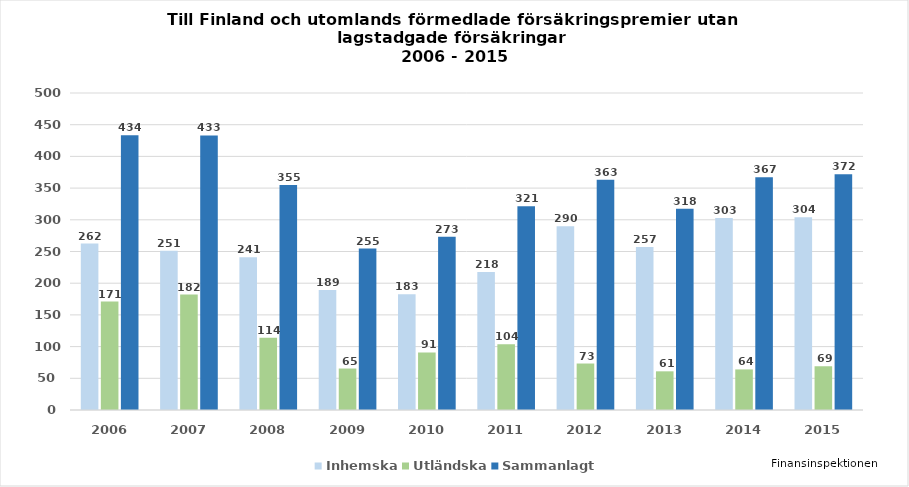
| Category | Inhemska | Utländska | Sammanlagt |
|---|---|---|---|
| 2006.0 | 262.471 | 171.056 | 433.526 |
| 2007.0 | 251 | 182 | 433 |
| 2008.0 | 241 | 114 | 355 |
| 2009.0 | 189.249 | 65.417 | 254.666 |
| 2010.0 | 182.562 | 90.729 | 273.291 |
| 2011.0 | 217.55 | 103.894 | 321.444 |
| 2012.0 | 289.922 | 73.321 | 363.243 |
| 2013.0 | 257 | 61 | 317.523 |
| 2014.0 | 303 | 64 | 367 |
| 2015.0 | 304 | 69 | 372 |